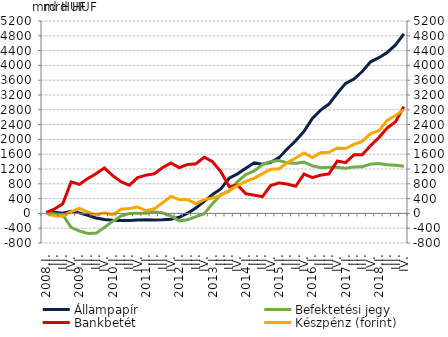
| Category | Állampapír  | Befektetési jegy  |
|---|---|---|
| 2008.I. | 22.215 | 26.165 |
| II. | 32.196 | -14.599 |
| III. | 3.655 | -38.376 |
| IV. | 58.993 | -379.05 |
| 2009.I. | 13.608 | -476.11 |
| II. | -50.936 | -540.979 |
| III. | -124.423 | -536.509 |
| IV. | -166.278 | -380.531 |
| 2010.I. | -187.825 | -213.951 |
| II. | -188.827 | -69.989 |
| III. | -192.032 | -3.064 |
| IV. | -177.74 | 5.307 |
| 2011.I. | -169.063 | 6.968 |
| II. | -175.678 | 38.963 |
| III. | -173.95 | 16.305 |
| IV. | -158.1 | -70.24 |
| 2012.I. | -104.526 | -202.446 |
| II. | 6.445 | -172.071 |
| III. | 148.428 | -89.3 |
| IV. | 326.618 | -10.203 |
| 2013.I. | 512.148 | 263.554 |
| II. | 662.178 | 506.175 |
| III. | 950.434 | 605.191 |
| IV. | 1068.977 | 855.499 |
| 2014.I. | 1219.915 | 1051.948 |
| II. | 1364.507 | 1145.231 |
| III. | 1327.264 | 1318.321 |
| IV. | 1382.463 | 1404.686 |
| 2015.I. | 1506.697 | 1428.23 |
| II. | 1746.659 | 1365.979 |
| III. | 1964.404 | 1353.345 |
| IV. | 2218.956 | 1386.365 |
| 2016.I. | 2567.788 | 1285.564 |
| II. | 2790.9 | 1237.106 |
| III. | 2955.272 | 1247.044 |
| IV. | 3246.51 | 1245.201 |
| 2017.I. | 3513.983 | 1219.035 |
| II. | 3631.932 | 1256.159 |
| III. | 3835.071 | 1259.364 |
| IV. | 4097.594 | 1332.867 |
| 2018.I. | 4208.136 | 1346.313 |
| II. | 4349.76 | 1314.603 |
| III. | 4554.652 | 1301.768 |
| IV. | 4852.191 | 1274.645 |